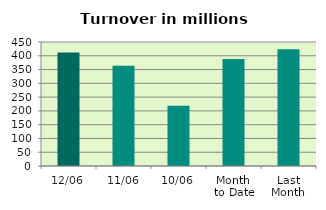
| Category | Series 0 |
|---|---|
| 12/06 | 412.27 |
| 11/06 | 364.11 |
| 10/06 | 219.071 |
| Month 
to Date | 388.128 |
| Last
Month | 424.091 |